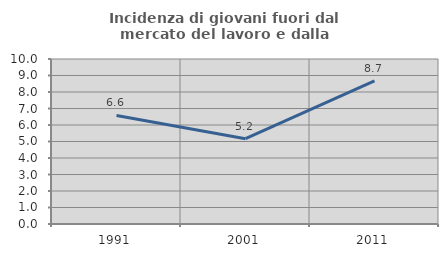
| Category | Incidenza di giovani fuori dal mercato del lavoro e dalla formazione  |
|---|---|
| 1991.0 | 6.577 |
| 2001.0 | 5.172 |
| 2011.0 | 8.668 |